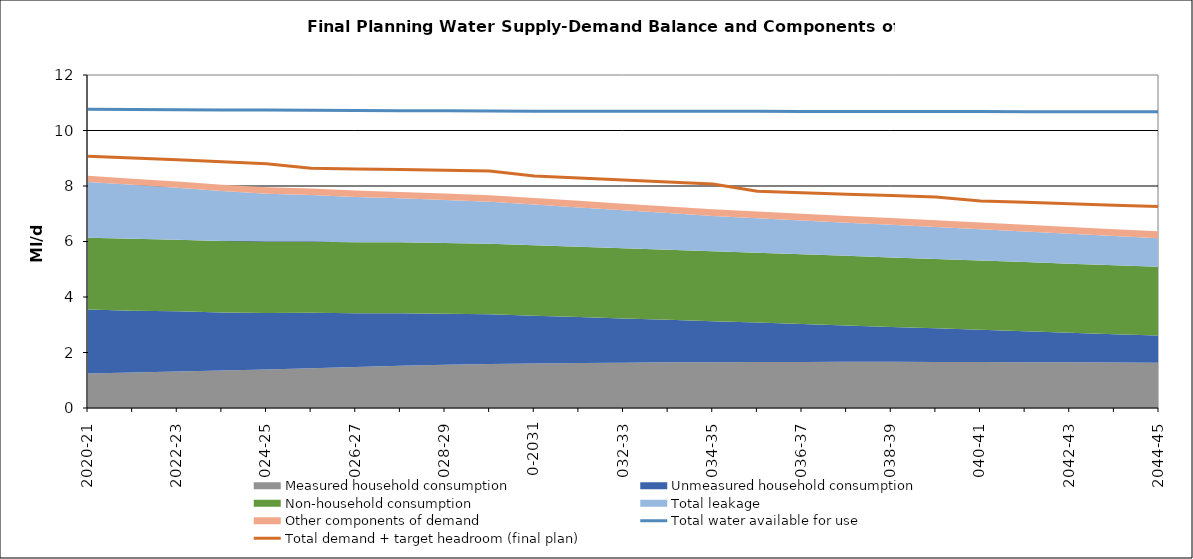
| Category | Total water available for use | Total demand + target headroom (final plan) |
|---|---|---|
| 0 | 10.762 | 9.07 |
| 1 | 10.756 | 9.005 |
| 2 | 10.749 | 8.948 |
| 3 | 10.743 | 8.872 |
| 4 | 10.736 | 8.805 |
| 5 | 10.729 | 8.64 |
| 6 | 10.723 | 8.609 |
| 7 | 10.716 | 8.593 |
| 8 | 10.709 | 8.564 |
| 9 | 10.703 | 8.536 |
| 10 | 10.698 | 8.36 |
| 11 | 10.696 | 8.29 |
| 12 | 10.694 | 8.213 |
| 13 | 10.693 | 8.142 |
| 14 | 10.691 | 8.07 |
| 15 | 10.689 | 7.812 |
| 16 | 10.688 | 7.758 |
| 17 | 10.686 | 7.707 |
| 18 | 10.684 | 7.656 |
| 19 | 10.683 | 7.604 |
| 20 | 10.681 | 7.461 |
| 21 | 10.679 | 7.412 |
| 22 | 10.678 | 7.359 |
| 23 | 10.676 | 7.308 |
| 24 | 10.675 | 7.263 |